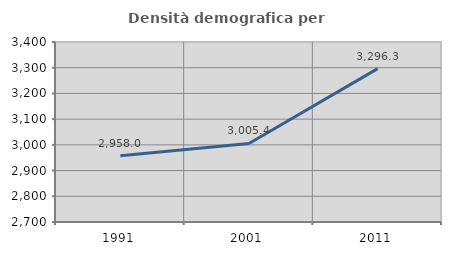
| Category | Densità demografica |
|---|---|
| 1991.0 | 2958.046 |
| 2001.0 | 3005.42 |
| 2011.0 | 3296.333 |